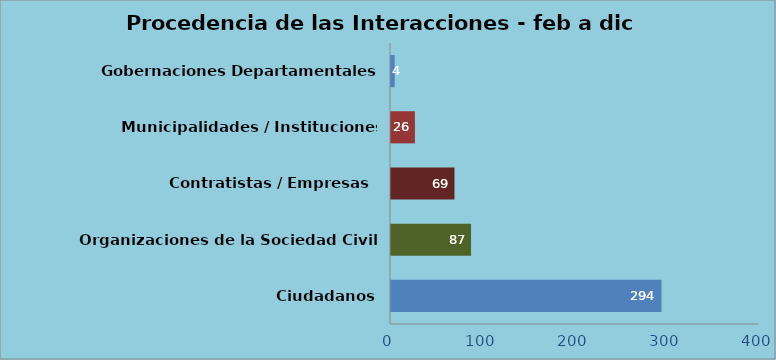
| Category | Series 0 |
|---|---|
| Ciudadanos | 294 |
| Organizaciones de la Sociedad Civil | 87 |
| Contratistas / Empresas  | 69 |
| Municipalidades / Instituciones Gubernamentales | 26 |
| Gobernaciones Departamentales | 4 |